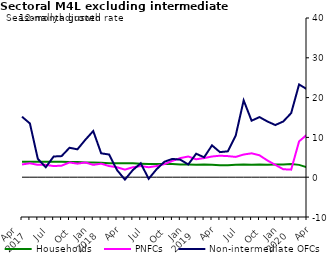
| Category | zero | Households | PNFCs | Non-intermediate OFCs |
|---|---|---|---|---|
| Apr 
2017 | 0 | 3.9 | 3.2 | 15.2 |
|  | 0 | 3.9 | 3.5 | 13.5 |
|  | 0 | 3.9 | 3.1 | 4.6 |
| Jul | 0 | 3.9 | 3.1 | 2.5 |
|  | 0 | 3.9 | 2.8 | 5.2 |
|  | 0 | 3.9 | 2.9 | 5.3 |
| Oct | 0 | 3.8 | 3.7 | 7.4 |
|  | 0 | 3.8 | 3.4 | 7 |
|  | 0 | 3.7 | 3.7 | 9.4 |
| Jan 
2018 | 0 | 3.7 | 3.1 | 11.6 |
|  | 0 | 3.6 | 3.4 | 6 |
|  | 0 | 3.5 | 2.8 | 5.7 |
| Apr | 0 | 3.5 | 2.5 | 1.8 |
|  | 0 | 3.5 | 1.9 | -0.6 |
|  | 0 | 3.5 | 2.5 | 1.8 |
| Jul | 0 | 3.4 | 2.8 | 3.5 |
|  | 0 | 3.3 | 2.5 | -0.4 |
|  | 0 | 3.3 | 2.8 | 2 |
| Oct | 0 | 3.3 | 3.3 | 3.9 |
|  | 0 | 3.3 | 4.1 | 4.6 |
|  | 0 | 3.2 | 4.8 | 4.4 |
| Jan 
2019 | 0 | 3.2 | 5.2 | 3.2 |
|  | 0 | 3.1 | 4.5 | 5.9 |
|  | 0 | 3.2 | 4.8 | 5 |
| Apr | 0 | 3.1 | 5.2 | 8 |
|  | 0 | 3 | 5.4 | 6.3 |
|  | 0 | 3 | 5.3 | 6.5 |
| Jul | 0 | 3.1 | 5.1 | 10.5 |
|  | 0 | 3.2 | 5.7 | 19.3 |
|  | 0 | 3.1 | 6 | 14.2 |
| Oct | 0 | 3.2 | 5.5 | 15.1 |
|  | 0 | 3.1 | 4.2 | 14 |
|  | 0 | 3.2 | 3.1 | 13.1 |
| Jan 
2020 | 0 | 3.2 | 2 | 14 |
|  | 0 | 3.3 | 1.9 | 16.1 |
|  | 0 | 3.1 | 9 | 23.3 |
| Apr | 0 | 2.5 | 10.7 | 22.1 |